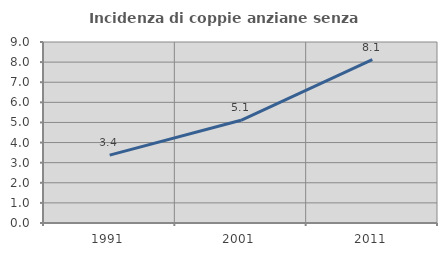
| Category | Incidenza di coppie anziane senza figli  |
|---|---|
| 1991.0 | 3.375 |
| 2001.0 | 5.107 |
| 2011.0 | 8.129 |